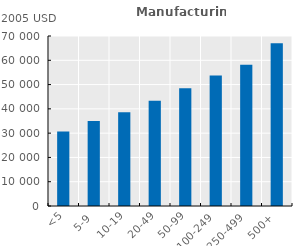
| Category | Series 0 |
|---|---|
| <5 | 30648.88 |
| 5-9 | 35027.764 |
| 10-19 | 38638.833 |
| 20-49 | 43294.882 |
| 50-99 | 48434.252 |
| 100-249 | 53685.507 |
| 250-499 | 58199.49 |
| 500+ | 67049.203 |